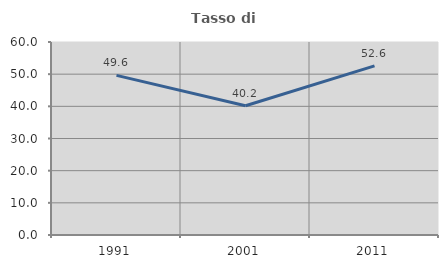
| Category | Tasso di occupazione   |
|---|---|
| 1991.0 | 49.621 |
| 2001.0 | 40.196 |
| 2011.0 | 52.564 |